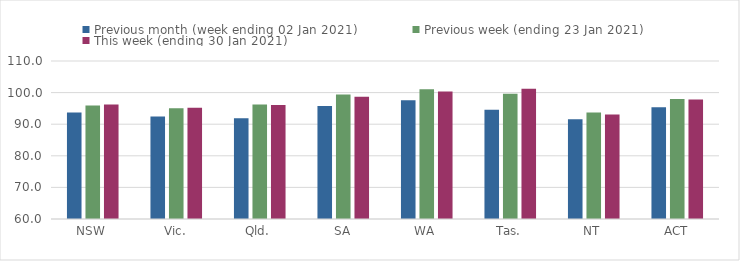
| Category | Previous month (week ending 02 Jan 2021) | Previous week (ending 23 Jan 2021) | This week (ending 30 Jan 2021) |
|---|---|---|---|
| NSW | 93.71 | 95.89 | 96.23 |
| Vic. | 92.44 | 95.04 | 95.2 |
| Qld. | 91.92 | 96.23 | 96.05 |
| SA | 95.78 | 99.37 | 98.68 |
| WA | 97.59 | 101.05 | 100.37 |
| Tas. | 94.56 | 99.61 | 101.24 |
| NT | 91.6 | 93.73 | 93.09 |
| ACT | 95.37 | 97.97 | 97.85 |